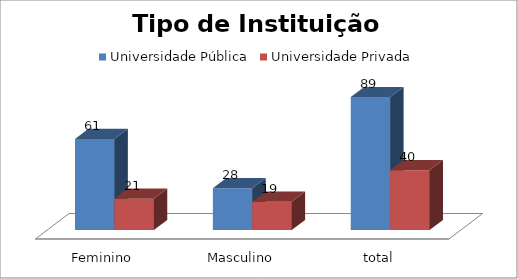
| Category | Universidade Pública | Universidade Privada |
|---|---|---|
| Feminino | 61 | 21 |
| Masculino | 28 | 19 |
| total | 89 | 40 |